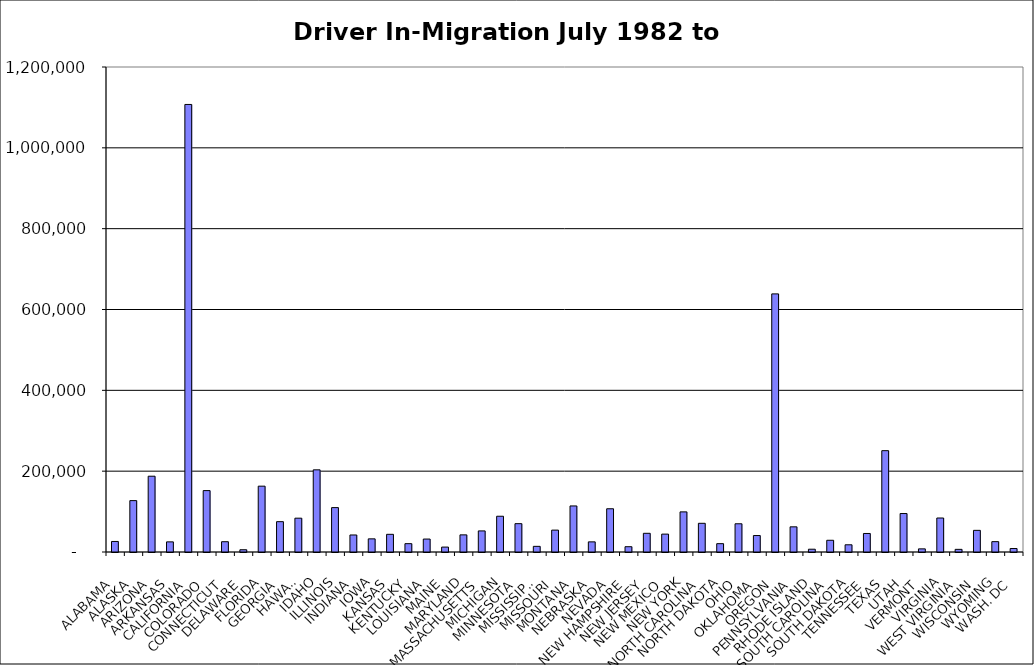
| Category | Series 0 |
|---|---|
| ALABAMA | 26073.5 |
| ALASKA | 127137.5 |
| ARIZONA | 187530 |
| ARKANSAS | 25087.5 |
| CALIFORNIA | 1107309.5 |
| COLORADO | 151916 |
| CONNECTICUT | 25444 |
| DELAWARE | 5584.5 |
| FLORIDA | 162895 |
| GEORGIA | 75046 |
| HAWAII | 83665.5 |
| IDAHO | 203300.5 |
| ILLINOIS | 109852.5 |
| INDIANA | 42126 |
| IOWA | 32535.5 |
| KANSAS | 43731.5 |
| KENTUCKY | 20635 |
| LOUISIANA | 32043.5 |
| MAINE | 12160.5 |
| MARYLAND | 42385 |
| MASSACHUSETTS | 52167 |
| MICHIGAN | 88474 |
| MINNESOTA | 70090.5 |
| MISSISSIPPI | 13971 |
| MISSOURI | 54154 |
| MONTANA | 113958 |
| NEBRASKA | 25071.5 |
| NEVADA | 106980 |
| NEW HAMPSHIRE | 13095.5 |
| NEW JERSEY | 46271 |
| NEW MEXICO | 44227 |
| NEW YORK | 99275 |
| NORTH CAROLINA | 71016.5 |
| NORTH DAKOTA | 20607.5 |
| OHIO | 69841.5 |
| OKLAHOMA | 40743 |
| OREGON | 638648 |
| PENNSYLVANIA | 62276.5 |
| RHODE ISLAND | 6907 |
| SOUTH CAROLINA | 29022.5 |
| SOUTH DAKOTA | 17851.5 |
| TENNESSEE | 45826.5 |
| TEXAS | 250736 |
| UTAH | 95168.5 |
| VERMONT | 7745 |
| VIRGINIA | 84096 |
| WEST VIRGINIA | 6558.5 |
| WISCONSIN | 53572.5 |
| WYOMING | 25606 |
| WASH. DC | 8608 |